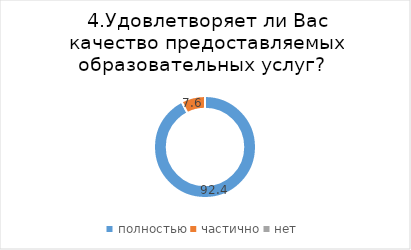
| Category | Series 0 |
|---|---|
| полностью | 92.424 |
| частично | 7.576 |
| нет | 0 |